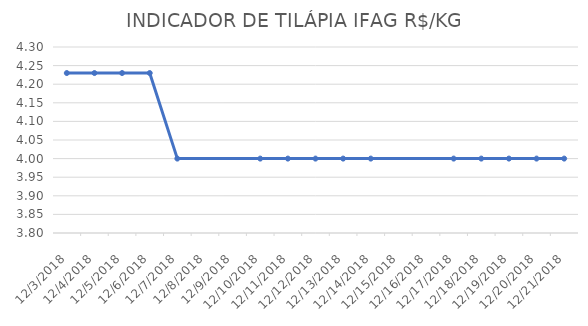
| Category | INDICADOR DE TILÁPIA IFAG |
|---|---|
| 12/3/18 | 4.23 |
| 12/4/18 | 4.23 |
| 12/5/18 | 4.23 |
| 12/6/18 | 4.23 |
| 12/7/18 | 4 |
| 12/10/18 | 4 |
| 12/11/18 | 4 |
| 12/12/18 | 4 |
| 12/13/18 | 4 |
| 12/14/18 | 4 |
| 12/17/18 | 4 |
| 12/18/18 | 4 |
| 12/19/18 | 4 |
| 12/20/18 | 4 |
| 12/21/18 | 4 |